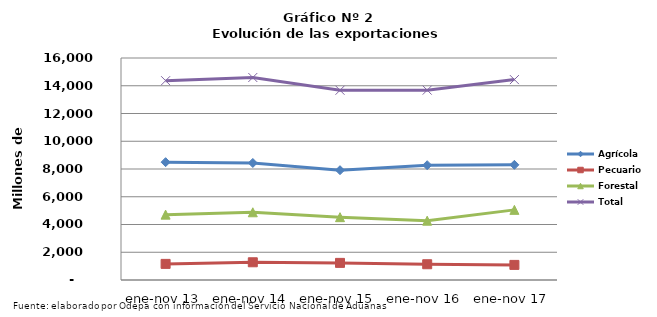
| Category | Agrícola | Pecuario | Forestal | Total |
|---|---|---|---|---|
| ene-nov 13 | 8492618 | 1161617 | 4711287 | 14365522 |
| ene-nov 14 | 8435448 | 1278119 | 4881145 | 14594712 |
| ene-nov 15 | 7914034 | 1233633 | 4528541 | 13676208 |
| ene-nov 16 | 8273367 | 1136133 | 4274987 | 13684487 |
| ene-nov 17 | 8300286 | 1088954 | 5054258 | 14443498 |